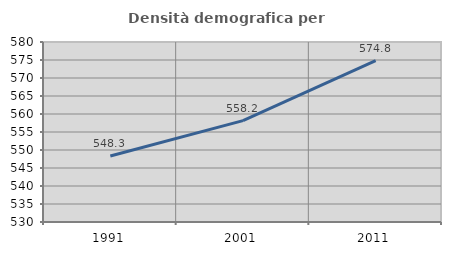
| Category | Densità demografica |
|---|---|
| 1991.0 | 548.313 |
| 2001.0 | 558.166 |
| 2011.0 | 574.849 |